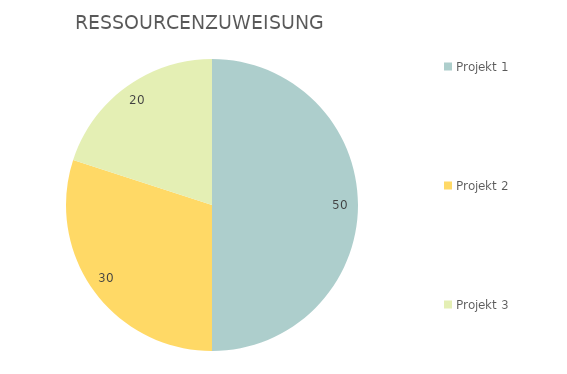
| Category | Series 0 |
|---|---|
| Projekt 1 | 50 |
| Projekt 2 | 30 |
| Projekt 3 | 20 |